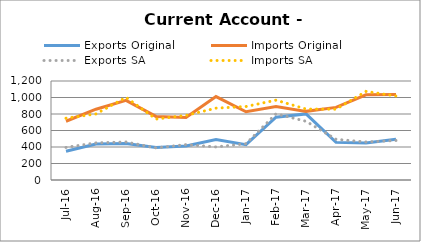
| Category | Exports Original | Imports Original | Exports SA | Imports SA |
|---|---|---|---|---|
| 2016-07-11 | 349 | 712 | 395 | 749 |
| 2016-08-11 | 435 | 858 | 450 | 801 |
| 2016-09-11 | 443 | 966 | 461 | 1002 |
| 2016-10-11 | 394 | 771 | 389 | 739 |
| 2016-11-11 | 413 | 759 | 429 | 783 |
| 2016-12-11 | 491 | 1011 | 401 | 871 |
| 2017-01-11 | 428 | 827 | 440 | 891 |
| 2017-02-11 | 761 | 890 | 802 | 968 |
| 2017-03-11 | 801 | 832 | 712 | 860 |
| 2017-04-11 | 456 | 880 | 493 | 858 |
| 2017-05-11 | 449 | 1033 | 461 | 1074 |
| 2017-06-11 | 495 | 1037 | 479 | 1018 |